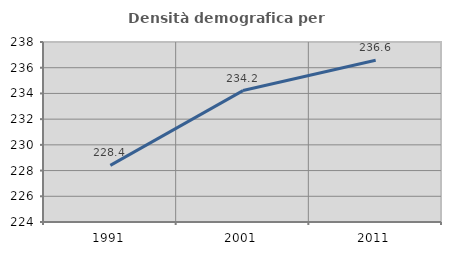
| Category | Densità demografica |
|---|---|
| 1991.0 | 228.406 |
| 2001.0 | 234.221 |
| 2011.0 | 236.579 |